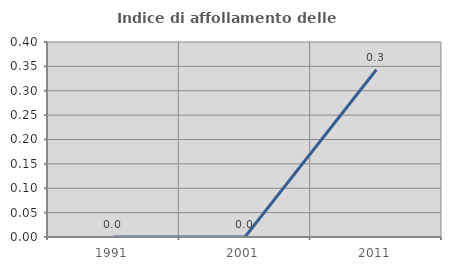
| Category | Indice di affollamento delle abitazioni  |
|---|---|
| 1991.0 | 0 |
| 2001.0 | 0 |
| 2011.0 | 0.343 |